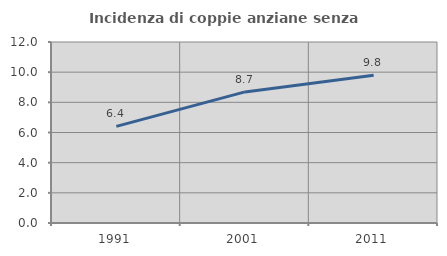
| Category | Incidenza di coppie anziane senza figli  |
|---|---|
| 1991.0 | 6.406 |
| 2001.0 | 8.692 |
| 2011.0 | 9.796 |